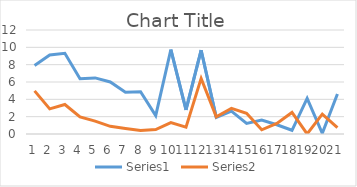
| Category | Series 0 | Series 1 |
|---|---|---|
| 0 | 7.912 | 4.975 |
| 1 | 9.114 | 2.897 |
| 2 | 9.316 | 3.402 |
| 3 | 6.384 | 1.975 |
| 4 | 6.474 | 1.481 |
| 5 | 6.002 | 0.886 |
| 6 | 4.822 | 0.627 |
| 7 | 4.878 | 0.391 |
| 8 | 2.114 | 0.508 |
| 9 | 9.732 | 1.324 |
| 10 | 2.788 | 0.789 |
| 11 | 9.664 | 6.413 |
| 12 | 1.908 | 1.991 |
| 13 | 2.638 | 2.968 |
| 14 | 1.223 | 2.395 |
| 15 | 1.598 | 0.485 |
| 16 | 1.069 | 1.227 |
| 17 | 0.429 | 2.485 |
| 18 | 4.103 | 0.009 |
| 19 | 0.077 | 2.294 |
| 20 | 4.62 | 0.728 |